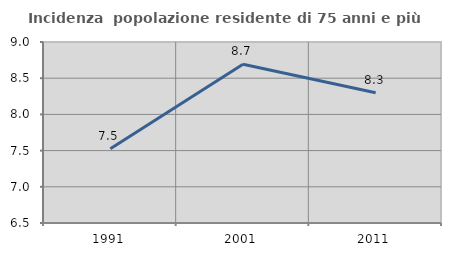
| Category | Incidenza  popolazione residente di 75 anni e più |
|---|---|
| 1991.0 | 7.525 |
| 2001.0 | 8.691 |
| 2011.0 | 8.299 |